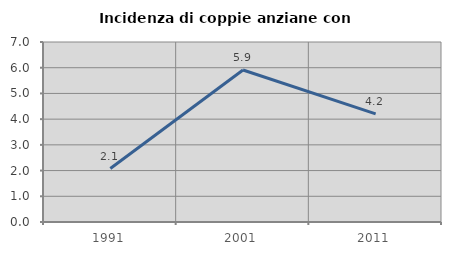
| Category | Incidenza di coppie anziane con figli |
|---|---|
| 1991.0 | 2.08 |
| 2001.0 | 5.911 |
| 2011.0 | 4.203 |